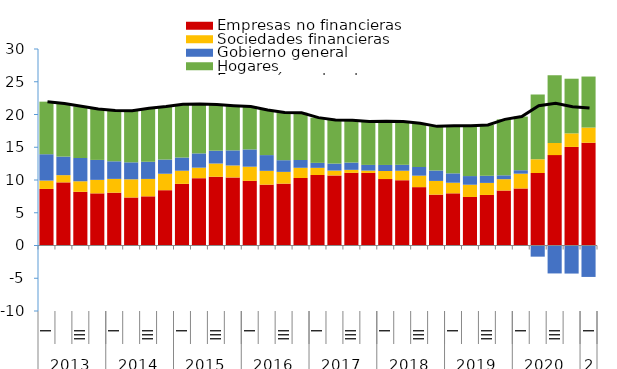
| Category | Empresas no financieras | Sociedades financieras | Gobierno general | Hogares |
|---|---|---|---|---|
| 0 | 8.633 | 1.281 | 4.021 | 8.026 |
| 1 | 9.639 | 1.102 | 2.834 | 8.088 |
| 2 | 8.194 | 1.612 | 3.551 | 7.899 |
| 3 | 7.962 | 2.059 | 3.046 | 7.77 |
| 4 | 8.063 | 2.107 | 2.684 | 7.756 |
| 5 | 7.331 | 2.777 | 2.588 | 7.868 |
| 6 | 7.507 | 2.657 | 2.621 | 8.166 |
| 7 | 8.443 | 2.511 | 2.166 | 8.096 |
| 8 | 9.412 | 2.003 | 2.018 | 8.13 |
| 9 | 10.285 | 1.601 | 2.176 | 7.561 |
| 10 | 10.497 | 2.02 | 1.96 | 7.047 |
| 11 | 10.397 | 1.821 | 2.305 | 6.827 |
| 12 | 9.869 | 2.163 | 2.637 | 6.551 |
| 13 | 9.293 | 2.106 | 2.403 | 6.9 |
| 14 | 9.447 | 1.792 | 1.783 | 7.282 |
| 15 | 10.307 | 1.558 | 1.188 | 7.209 |
| 16 | 10.766 | 1.091 | 0.759 | 6.906 |
| 17 | 10.702 | 0.736 | 1.069 | 6.661 |
| 18 | 11.096 | 0.455 | 1.112 | 6.447 |
| 19 | 11.076 | 0.36 | 0.868 | 6.614 |
| 20 | 10.139 | 1.239 | 0.92 | 6.69 |
| 21 | 9.966 | 1.446 | 0.906 | 6.594 |
| 22 | 8.91 | 1.75 | 1.321 | 6.669 |
| 23 | 7.767 | 2.093 | 1.588 | 6.741 |
| 24 | 7.966 | 1.616 | 1.434 | 7.276 |
| 25 | 7.411 | 1.868 | 1.321 | 7.668 |
| 26 | 7.719 | 1.837 | 1.089 | 7.754 |
| 27 | 8.393 | 1.733 | 0.59 | 8.537 |
| 28 | 8.708 | 2.258 | 0.528 | 8.193 |
| 29 | 11.072 | 2.09 | -1.704 | 9.883 |
| 30 | 13.8 | 1.855 | -4.266 | 10.32 |
| 31 | 15.05 | 2.068 | -4.285 | 8.346 |
| 32 | 15.687 | 2.319 | -4.798 | 7.789 |